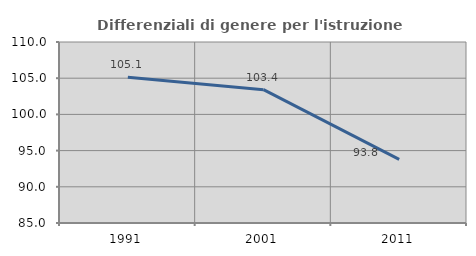
| Category | Differenziali di genere per l'istruzione superiore |
|---|---|
| 1991.0 | 105.12 |
| 2001.0 | 103.416 |
| 2011.0 | 93.799 |